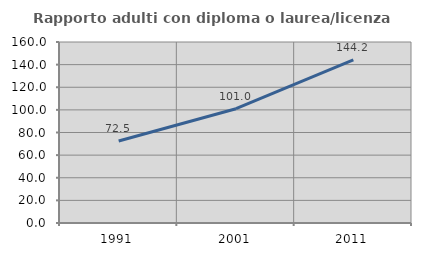
| Category | Rapporto adulti con diploma o laurea/licenza media  |
|---|---|
| 1991.0 | 72.454 |
| 2001.0 | 101.033 |
| 2011.0 | 144.201 |